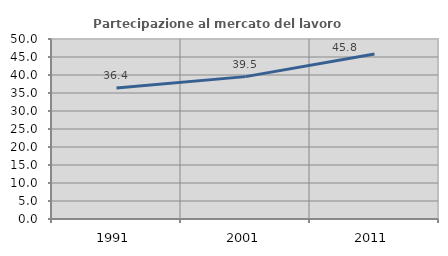
| Category | Partecipazione al mercato del lavoro  femminile |
|---|---|
| 1991.0 | 36.364 |
| 2001.0 | 39.55 |
| 2011.0 | 45.806 |